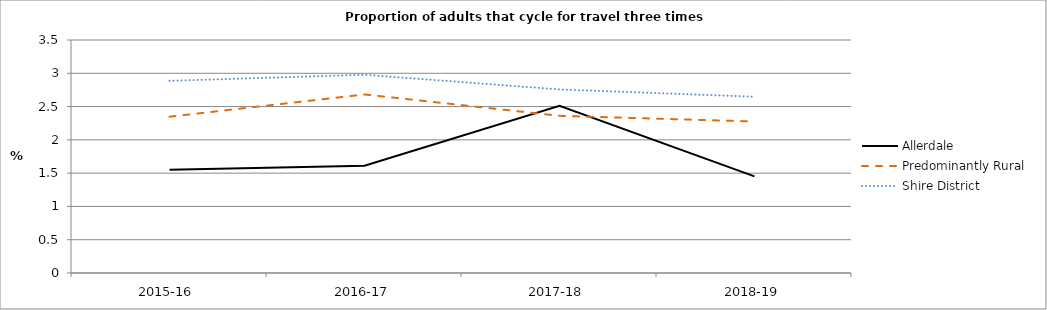
| Category | Allerdale | Predominantly Rural | Shire District |
|---|---|---|---|
| 2015-16 | 1.549 | 2.348 | 2.887 |
| 2016-17 | 1.612 | 2.682 | 2.978 |
| 2017-18 | 2.511 | 2.361 | 2.758 |
| 2018-19 | 1.452 | 2.276 | 2.647 |